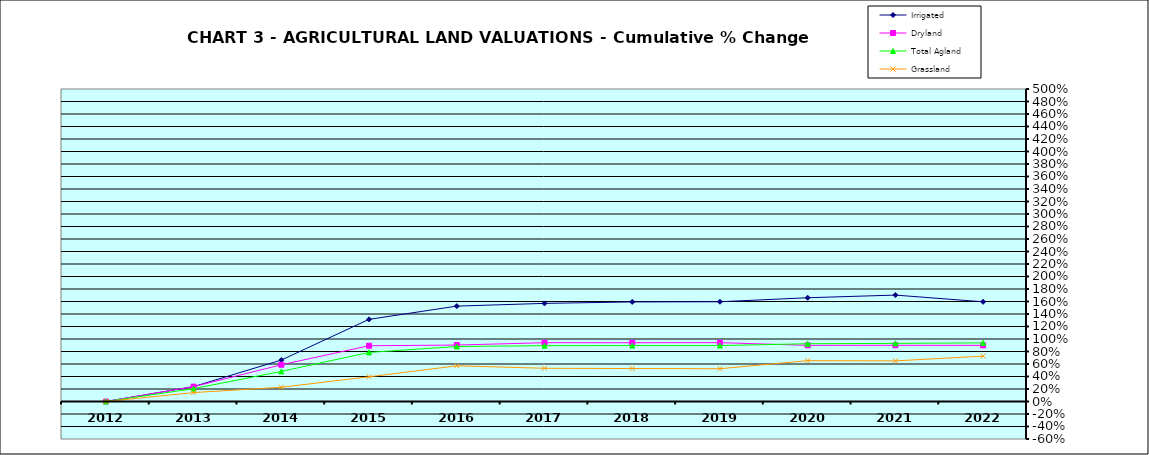
| Category | Irrigated | Dryland | Total Agland | Grassland |
|---|---|---|---|---|
| 2012.0 | 0 | 0 | 0 | 0 |
| 2013.0 | 0.238 | 0.238 | 0.206 | 0.142 |
| 2014.0 | 0.663 | 0.588 | 0.481 | 0.228 |
| 2015.0 | 1.314 | 0.892 | 0.785 | 0.395 |
| 2016.0 | 1.526 | 0.903 | 0.88 | 0.571 |
| 2017.0 | 1.57 | 0.941 | 0.893 | 0.531 |
| 2018.0 | 1.593 | 0.94 | 0.895 | 0.528 |
| 2019.0 | 1.596 | 0.942 | 0.895 | 0.525 |
| 2020.0 | 1.66 | 0.898 | 0.924 | 0.654 |
| 2021.0 | 1.703 | 0.899 | 0.93 | 0.65 |
| 2022.0 | 1.595 | 0.898 | 0.938 | 0.725 |